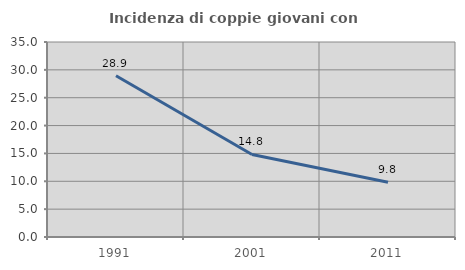
| Category | Incidenza di coppie giovani con figli |
|---|---|
| 1991.0 | 28.943 |
| 2001.0 | 14.809 |
| 2011.0 | 9.819 |